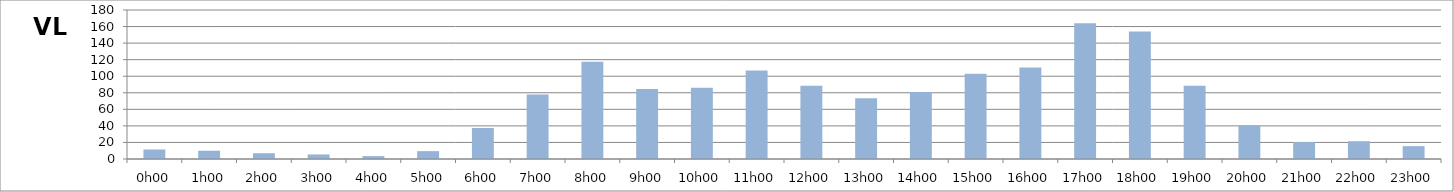
| Category | VL |
|---|---|
| 0.0 | 11.5 |
| 0.041666666666666664 | 10 |
| 0.08333333333333333 | 7 |
| 0.125 | 5.5 |
| 0.16666666666666666 | 3.5 |
| 0.20833333333333334 | 9.5 |
| 0.25 | 37.5 |
| 0.2916666666666667 | 78 |
| 0.3333333333333333 | 117.5 |
| 0.375 | 84.5 |
| 0.4166666666666667 | 86 |
| 0.4583333333333333 | 107 |
| 0.5 | 88.5 |
| 0.5416666666666666 | 73.5 |
| 0.5833333333333334 | 81 |
| 0.625 | 103 |
| 0.6666666666666666 | 110.5 |
| 0.7083333333333334 | 164 |
| 0.75 | 154 |
| 0.7916666666666666 | 88.5 |
| 0.8333333333333334 | 40.5 |
| 0.875 | 20.5 |
| 0.9166666666666666 | 21.5 |
| 0.9583333333333334 | 15.5 |